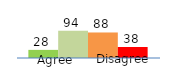
| Category | Series 0 | Series 1 | Series 2 | Series 3 |
|---|---|---|---|---|
| 0 | 28 | 94 | 88 | 38 |